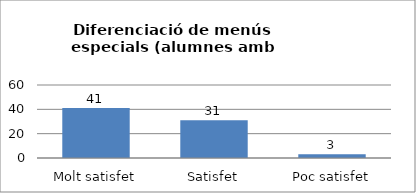
| Category | Series 0 |
|---|---|
| Molt satisfet | 41 |
| Satisfet | 31 |
| Poc satisfet | 3 |